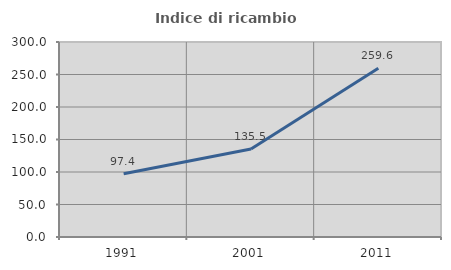
| Category | Indice di ricambio occupazionale  |
|---|---|
| 1991.0 | 97.351 |
| 2001.0 | 135.484 |
| 2011.0 | 259.551 |